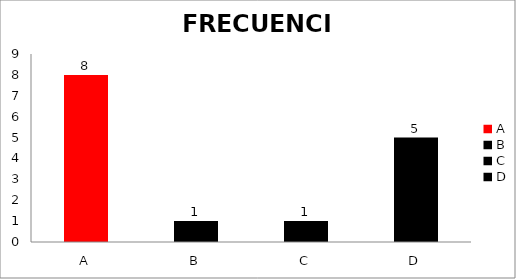
| Category | Series 0 |
|---|---|
| A | 8 |
| B | 1 |
| C | 1 |
| D | 5 |